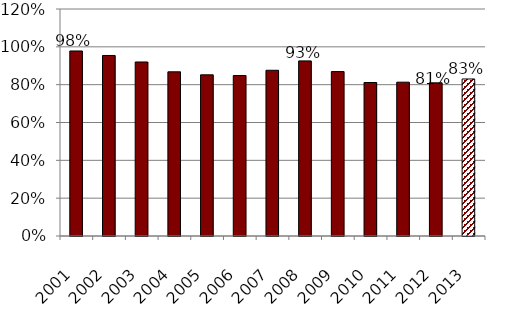
| Category | Percent of ARC Paid |
|---|---|
| 2001.0 | 0.978 |
| 2002.0 | 0.954 |
| 2003.0 | 0.92 |
| 2004.0 | 0.868 |
| 2005.0 | 0.852 |
| 2006.0 | 0.848 |
| 2007.0 | 0.876 |
| 2008.0 | 0.926 |
| 2009.0 | 0.869 |
| 2010.0 | 0.811 |
| 2011.0 | 0.813 |
| 2012.0 | 0.81 |
| 2013.0 | 0.83 |